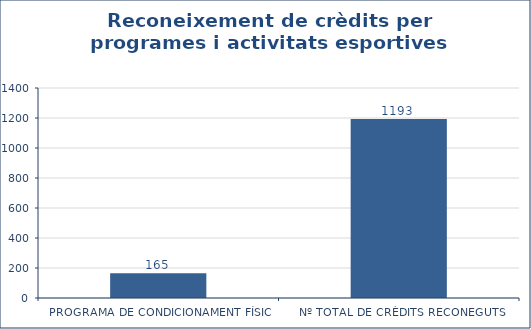
| Category | Series 0 |
|---|---|
| PROGRAMA DE CONDICIONAMENT FÍSIC | 165 |
| Nº TOTAL DE CRÈDITS RECONEGUTS | 1193 |